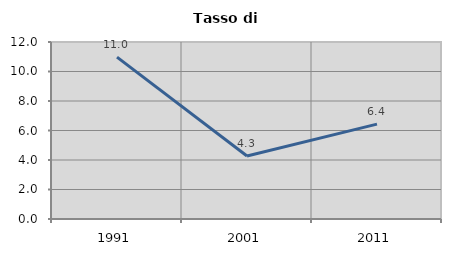
| Category | Tasso di disoccupazione   |
|---|---|
| 1991.0 | 10.978 |
| 2001.0 | 4.272 |
| 2011.0 | 6.433 |